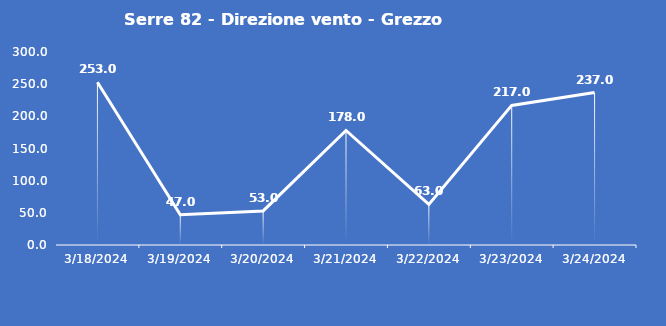
| Category | Serre 82 - Direzione vento - Grezzo (°N) |
|---|---|
| 3/18/24 | 253 |
| 3/19/24 | 47 |
| 3/20/24 | 53 |
| 3/21/24 | 178 |
| 3/22/24 | 63 |
| 3/23/24 | 217 |
| 3/24/24 | 237 |